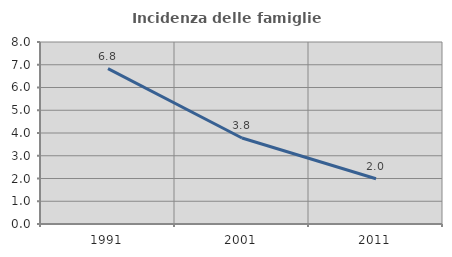
| Category | Incidenza delle famiglie numerose |
|---|---|
| 1991.0 | 6.828 |
| 2001.0 | 3.781 |
| 2011.0 | 1.988 |